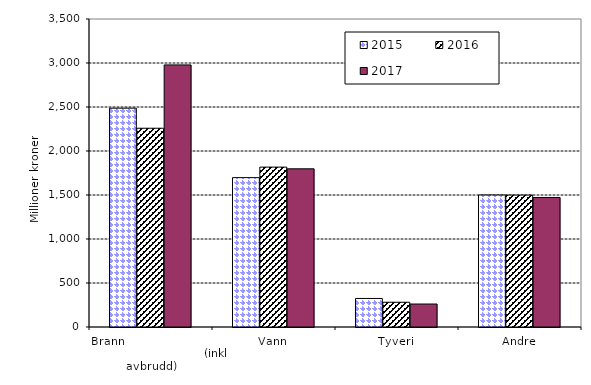
| Category | 2015 | 2016 | 2017 |
|---|---|---|---|
| Brann                                                       (inkl avbrudd) | 2486.577 | 2258.695 | 2978.266 |
| Vann | 1697.321 | 1816.834 | 1797.656 |
| Tyveri | 324.222 | 281.208 | 261.096 |
| Andre | 1500.007 | 1499.083 | 1471.808 |